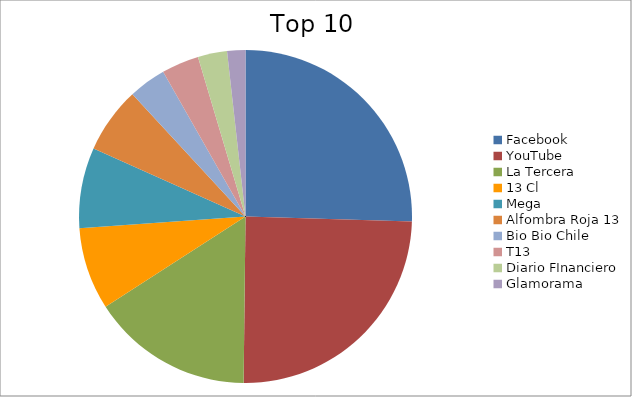
| Category | Series 0 |
|---|---|
| Facebook | 16.99 |
| YouTube | 16.46 |
| La Tercera | 10.47 |
| 13 Cl | 5.33 |
| Mega | 5.21 |
| Alfombra Roja 13 | 4.28 |
| Bio Bio Chile | 2.43 |
| T13 | 2.42 |
| Diario FInanciero | 1.89 |
| Glamorama | 1.18 |